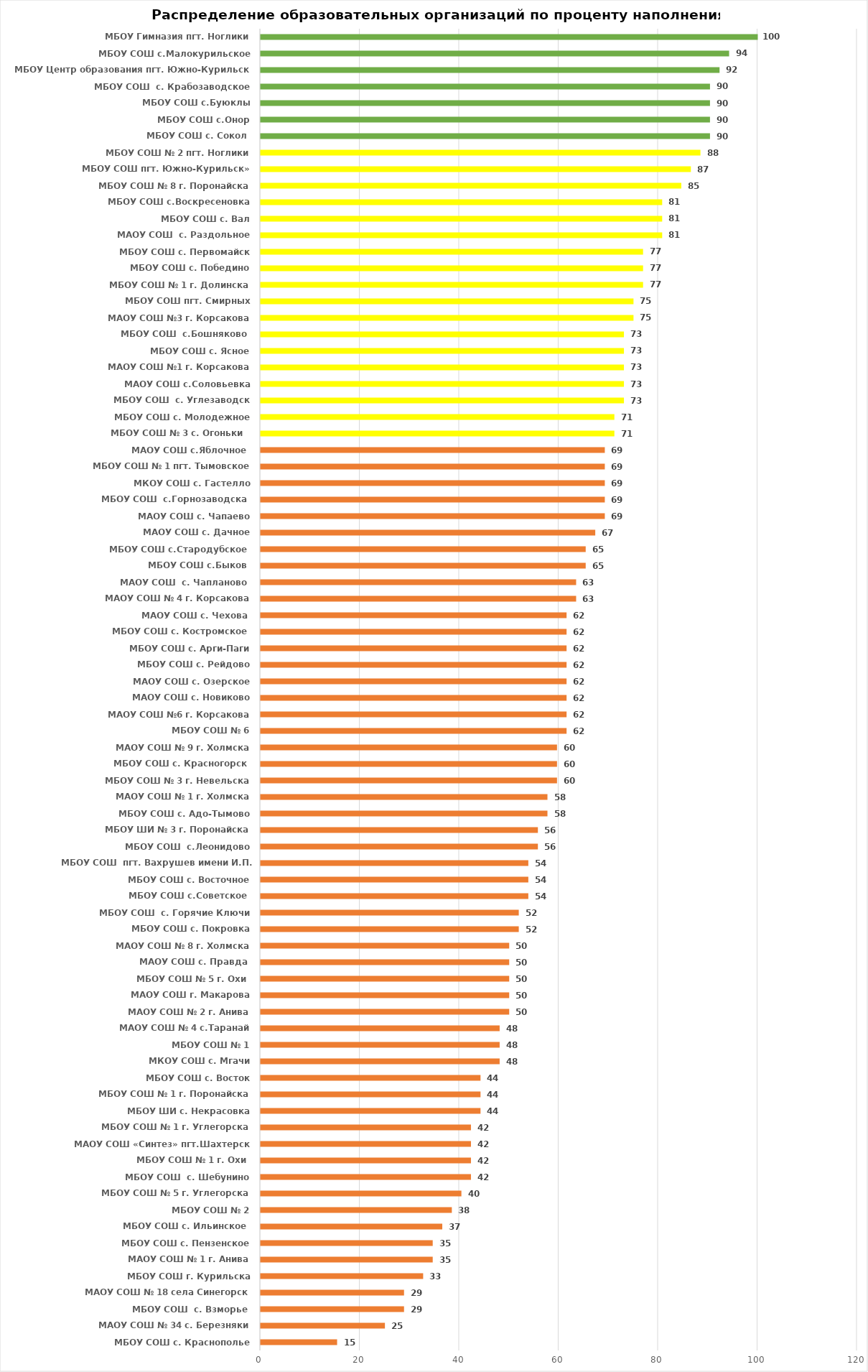
| Category | Series 0 |
|---|---|
| МБОУ СОШ с. Краснополье | 15.385 |
| МАОУ СОШ № 34 с. Березняки | 25 |
| МБОУ СОШ  с. Взморье  | 28.846 |
| МАОУ СОШ № 18 села Синегорск | 28.846 |
| МБОУ СОШ г. Курильска | 32.692 |
| МАОУ СОШ № 1 г. Анива | 34.615 |
| МБОУ СОШ с. Пензенское | 34.615 |
| МБОУ СОШ с. Ильинское  | 36.538 |
| МБОУ СОШ № 2 | 38.462 |
| МБОУ СОШ № 5 г. Углегорска | 40.385 |
| МБОУ СОШ  с. Шебунино | 42.308 |
| МБОУ СОШ № 1 г. Охи  | 42.308 |
| МАОУ СОШ «Синтез» пгт.Шахтерск | 42.308 |
| МБОУ СОШ № 1 г. Углегорска | 42.308 |
| МБОУ ШИ с. Некрасовка | 44.231 |
| МБОУ СОШ № 1 г. Поронайска | 44.231 |
| МБОУ СОШ с. Восток | 44.231 |
| МКОУ СОШ с. Мгачи | 48.077 |
| МБОУ СОШ № 1 | 48.077 |
| МАОУ СОШ № 4 с.Таранай | 48.077 |
| МАОУ СОШ № 2 г. Анива | 50 |
| МАОУ СОШ г. Макарова | 50 |
| МБОУ СОШ № 5 г. Охи  | 50 |
| МАОУ СОШ с. Правда  | 50 |
| МАОУ СОШ № 8 г. Холмска | 50 |
| МБОУ СОШ с. Покровка | 51.923 |
| МБОУ СОШ  с. Горячие Ключи | 51.923 |
| МБОУ СОШ с.Советское  | 53.846 |
| МБОУ СОШ с. Восточное | 53.846 |
| МБОУ СОШ  пгт. Вахрушев имени И.П. Фархутдинова | 53.846 |
| МБОУ СОШ  с.Леонидово | 55.769 |
| МБОУ ШИ № 3 г. Поронайска | 55.769 |
| МБОУ СОШ с. Адо-Тымово | 57.692 |
| МАОУ СОШ № 1 г. Холмска | 57.692 |
| МБОУ СОШ № 3 г. Невельска | 59.615 |
| МБОУ СОШ с. Красногорск  | 59.615 |
| МАОУ СОШ № 9 г. Холмска | 59.615 |
| МБОУ СОШ № 6 | 61.538 |
| МАОУ СОШ №6 г. Корсакова | 61.538 |
| МАОУ СОШ с. Новиково | 61.538 |
| МАОУ СОШ с. Озерское | 61.538 |
| МБОУ СОШ с. Рейдово | 61.538 |
| МБОУ СОШ с. Арги-Паги | 61.538 |
| МБОУ СОШ с. Костромское  | 61.538 |
| МАОУ СОШ с. Чехова  | 61.538 |
| МАОУ СОШ № 4 г. Корсакова | 63.462 |
| МАОУ СОШ  с. Чапланово  | 63.462 |
| МБОУ СОШ с.Быков  | 65.385 |
| МБОУ СОШ с.Стародубское  | 65.385 |
| МАОУ СОШ с. Дачное | 67.308 |
| МАОУ СОШ с. Чапаево | 69.231 |
| МБОУ СОШ  с.Горнозаводска  | 69.231 |
| МКОУ СОШ с. Гастелло | 69.231 |
| МБОУ СОШ № 1 пгт. Тымовское | 69.231 |
| МАОУ СОШ с.Яблочное  | 69.231 |
|  МБОУ СОШ № 3 с. Огоньки   | 71.154 |
| МБОУ СОШ с. Молодежное | 71.154 |
| МБОУ СОШ  с. Углезаводск | 73.077 |
| МАОУ СОШ с.Соловьевка | 73.077 |
| МАОУ СОШ №1 г. Корсакова | 73.077 |
| МБОУ СОШ с. Ясное | 73.077 |
| МБОУ СОШ  с.Бошняково  | 73.077 |
| МАОУ СОШ №3 г. Корсакова | 75 |
| МБОУ СОШ пгт. Смирных | 75 |
| МБОУ СОШ № 1 г. Долинска | 76.923 |
| МБОУ СОШ с. Победино | 76.923 |
| МБОУ СОШ с. Первомайск | 76.923 |
| МАОУ СОШ  с. Раздольное | 80.769 |
| МБОУ СОШ с. Вал | 80.769 |
| МБОУ СОШ с.Воскресеновка | 80.769 |
| МБОУ СОШ № 8 г. Поронайска | 84.615 |
| МБОУ СОШ пгт. Южно-Курильск» | 86.538 |
| МБОУ СОШ № 2 пгт. Ноглики | 88.462 |
| МБОУ СОШ с. Сокол  | 90.385 |
| МБОУ СОШ с.Онор | 90.385 |
| МБОУ СОШ с.Буюклы | 90.385 |
| МБОУ СОШ  с. Крабозаводское | 90.385 |
| МБОУ Центр образования пгт. Южно-Курильск | 92.308 |
| МБОУ СОШ с.Малокурильское | 94.231 |
| МБОУ Гимназия пгт. Ноглики | 100 |